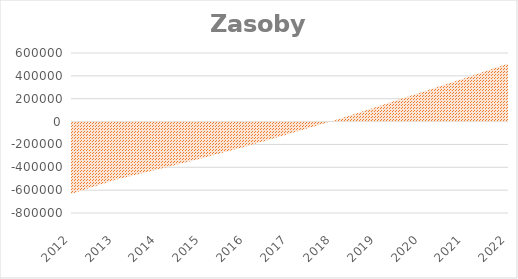
| Category | Zasoby mieszkaniowe |
|---|---|
| 2012.0 | -633000 |
| 2013.0 | -511000 |
| 2014.0 | -418000 |
| 2015.0 | -322000 |
| 2016.0 | -218000 |
| 2017.0 | -107000 |
| 2018.0 | 7000 |
| 2019.0 | 129000 |
| 2020.0 | 254000 |
| 2021.0 | 380000 |
| 2022.0 | 508000 |